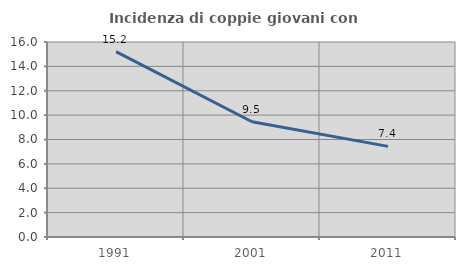
| Category | Incidenza di coppie giovani con figli |
|---|---|
| 1991.0 | 15.209 |
| 2001.0 | 9.459 |
| 2011.0 | 7.436 |